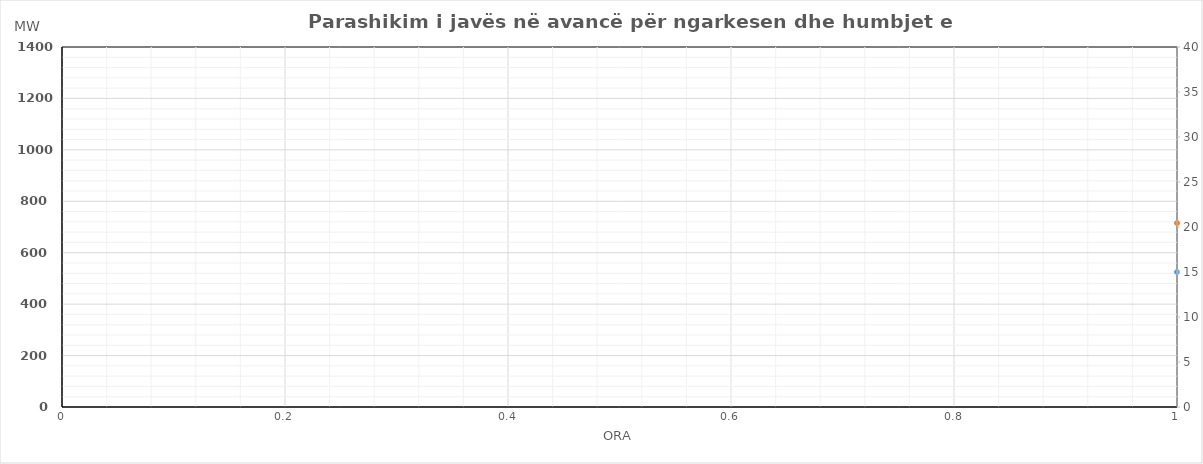
| Category | Ngarkesa (MWh) |
|---|---|
| 0 | 715.28 |
| 1 | 636.21 |
| 2 | 595.2 |
| 3 | 593.2 |
| 4 | 626.19 |
| 5 | 632.19 |
| 6 | 704.28 |
| 7 | 841.21 |
| 8 | 975.27 |
| 9 | 1052.27 |
| 10 | 1059.61 |
| 11 | 1048.6 |
| 12 | 1025.63 |
| 13 | 1029.6 |
| 14 | 956.63 |
| 15 | 920.54 |
| 16 | 922.53 |
| 17 | 964.46 |
| 18 | 1025.58 |
| 19 | 1135.69 |
| 20 | 1166.7 |
| 21 | 1082.6 |
| 22 | 990.6 |
| 23 | 849.64 |
| 24 | 653.48 |
| 25 | 593.41 |
| 26 | 568.4 |
| 27 | 573.4 |
| 28 | 605.39 |
| 29 | 624.39 |
| 30 | 745.38 |
| 31 | 937.41 |
| 32 | 1024.47 |
| 33 | 1042.47 |
| 34 | 998.41 |
| 35 | 994.5 |
| 36 | 1006.43 |
| 37 | 955.4 |
| 38 | 915.43 |
| 39 | 915.44 |
| 40 | 928.43 |
| 41 | 973.36 |
| 42 | 1081.38 |
| 43 | 1141.49 |
| 44 | 1151.5 |
| 45 | 1058.3 |
| 46 | 925.3 |
| 47 | 779.34 |
| 48 | 653.08 |
| 49 | 566.99 |
| 50 | 515.82 |
| 51 | 520.53 |
| 52 | 564.27 |
| 53 | 582.79 |
| 54 | 710.2 |
| 55 | 921.23 |
| 56 | 999.04 |
| 57 | 983.61 |
| 58 | 927.44 |
| 59 | 818.72 |
| 60 | 800.29 |
| 61 | 817.31 |
| 62 | 815.69 |
| 63 | 799.36 |
| 64 | 805.45 |
| 65 | 856.04 |
| 66 | 973.56 |
| 67 | 1088.82 |
| 68 | 1118.3 |
| 69 | 1042.59 |
| 70 | 891.92 |
| 71 | 707.46 |
| 72 | 607.98 |
| 73 | 532.11 |
| 74 | 502 |
| 75 | 507.2 |
| 76 | 550.69 |
| 77 | 569.29 |
| 78 | 690.38 |
| 79 | 897.91 |
| 80 | 960.27 |
| 81 | 954.77 |
| 82 | 897.41 |
| 83 | 814.2 |
| 84 | 793.93 |
| 85 | 809.9 |
| 86 | 812.43 |
| 87 | 798.14 |
| 88 | 804.33 |
| 89 | 849.56 |
| 90 | 1001.28 |
| 91 | 1111.69 |
| 92 | 1089.3 |
| 93 | 1011.2 |
| 94 | 875.7 |
| 95 | 687.94 |
| 96 | 600.21 |
| 97 | 527.94 |
| 98 | 498.13 |
| 99 | 505.83 |
| 100 | 535.72 |
| 101 | 553.52 |
| 102 | 659.81 |
| 103 | 841.34 |
| 104 | 950.8 |
| 105 | 972.8 |
| 106 | 936.64 |
| 107 | 904.93 |
| 108 | 851.76 |
| 109 | 853.43 |
| 110 | 854.66 |
| 111 | 855.47 |
| 112 | 830.96 |
| 113 | 856.59 |
| 114 | 964.51 |
| 115 | 1041.12 |
| 116 | 1071.33 |
| 117 | 987.83 |
| 118 | 854.63 |
| 119 | 684.47 |
| 120 | 593.52 |
| 121 | 533.35 |
| 122 | 504.94 |
| 123 | 508.04 |
| 124 | 543.23 |
| 125 | 554.23 |
| 126 | 637.12 |
| 127 | 790.95 |
| 128 | 932.91 |
| 129 | 1007.61 |
| 130 | 1018.05 |
| 131 | 959.94 |
| 132 | 929.17 |
| 133 | 915.64 |
| 134 | 876.67 |
| 135 | 786.88 |
| 136 | 768.47 |
| 137 | 791.9 |
| 138 | 856.42 |
| 139 | 965.23 |
| 140 | 1000.54 |
| 141 | 915.04 |
| 142 | 818.64 |
| 143 | 710.88 |
| 144 | 664.697 |
| 145 | 569.059 |
| 146 | 516.709 |
| 147 | 508.051 |
| 148 | 528.374 |
| 149 | 528.954 |
| 150 | 587.056 |
| 151 | 714.576 |
| 152 | 849.477 |
| 153 | 944.636 |
| 154 | 952.844 |
| 155 | 940.037 |
| 156 | 939.331 |
| 157 | 905.223 |
| 158 | 880.794 |
| 159 | 843.378 |
| 160 | 846.374 |
| 161 | 883.052 |
| 162 | 940.483 |
| 163 | 1030.224 |
| 164 | 1046.446 |
| 165 | 972.406 |
| 166 | 851.314 |
| 167 | 693.987 |